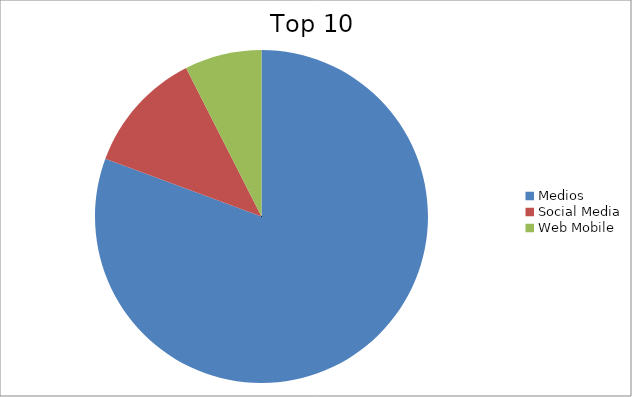
| Category | Series 0 |
|---|---|
| Medios | 80.64 |
| Social Media | 11.88 |
| Web Mobile | 7.48 |